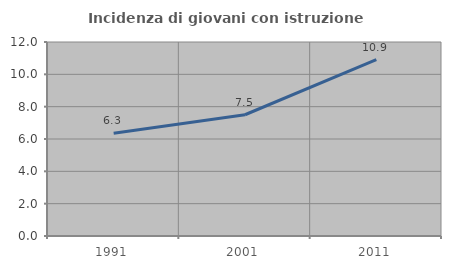
| Category | Incidenza di giovani con istruzione universitaria |
|---|---|
| 1991.0 | 6.349 |
| 2001.0 | 7.5 |
| 2011.0 | 10.909 |